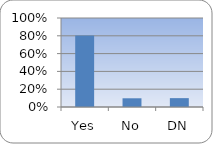
| Category | Series 0 |
|---|---|
| Yes | 0.802 |
| No | 0.098 |
| DN | 0.1 |